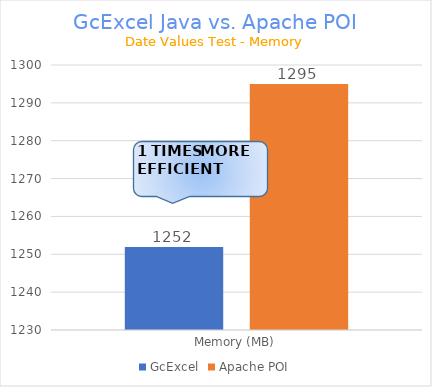
| Category | GcExcel | Apache POI |
|---|---|---|
| Memory (MB) | 1251.933 | 1294.959 |